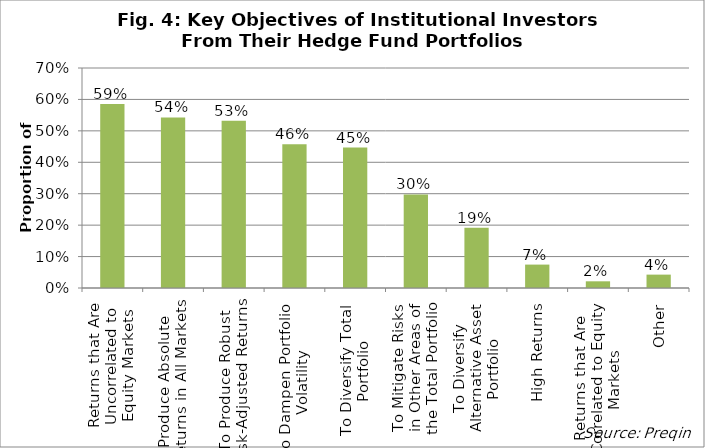
| Category | Proportion |
|---|---|
| Returns that Are
Uncorrelated to
Equity Markets | 0.585 |
| Produce Absolute
Returns in All Markets | 0.543 |
| To Produce Robust
Risk-Adjusted Returns | 0.532 |
| To Dampen Portfolio
Volatility | 0.457 |
| To Diversify Total
Portfolio | 0.447 |
| To Mitigate Risks
in Other Areas of
the Total Portfolio | 0.298 |
| To Diversify
Alternative Asset
Portfolio | 0.191 |
| High Returns | 0.074 |
| Returns that Are
Correlated to Equity
Markets | 0.021 |
| Other | 0.043 |